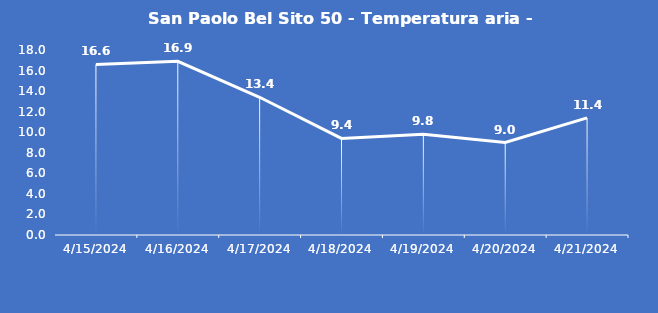
| Category | San Paolo Bel Sito 50 - Temperatura aria - Grezzo (°C) |
|---|---|
| 4/15/24 | 16.6 |
| 4/16/24 | 16.9 |
| 4/17/24 | 13.4 |
| 4/18/24 | 9.4 |
| 4/19/24 | 9.8 |
| 4/20/24 | 9 |
| 4/21/24 | 11.4 |